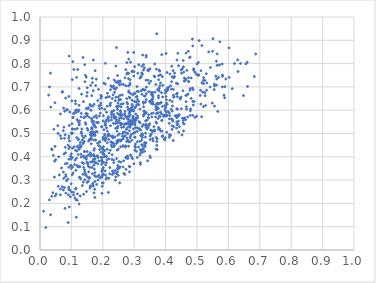
| Category | Series 0 |
|---|---|
| 0.24133575907295046 | 0.313 |
| 0.29681137395199564 | 0.501 |
| 0.5146433089513417 | 0.572 |
| 0.33936388168082465 | 0.531 |
| 0.09540957290847307 | 0.256 |
| 0.23797528929005785 | 0.569 |
| 0.3321072271578319 | 0.661 |
| 0.36888526393829935 | 0.711 |
| 0.2787899916616159 | 0.76 |
| 0.18313914826906252 | 0.459 |
| 0.268530565590514 | 0.539 |
| 0.20181165094042208 | 0.327 |
| 0.43556941891295553 | 0.568 |
| 0.1690899420757047 | 0.492 |
| 0.24917369250403676 | 0.469 |
| 0.23015126287975718 | 0.65 |
| 0.4723152782018156 | 0.853 |
| 0.2927946265178588 | 0.625 |
| 0.5509054937791694 | 0.907 |
| 0.2753449003418822 | 0.395 |
| 0.4010370395006366 | 0.659 |
| 0.1411642341868964 | 0.423 |
| 0.1244717191652619 | 0.432 |
| 0.3029622517354402 | 0.484 |
| 0.28274503329082434 | 0.465 |
| 0.2926548982961069 | 0.765 |
| 0.21447298175034424 | 0.46 |
| 0.2861844031500903 | 0.552 |
| 0.4246235664724103 | 0.665 |
| 0.2915581343551199 | 0.401 |
| 0.45584625142415736 | 0.556 |
| 0.07441713568750807 | 0.334 |
| 0.4533602886992796 | 0.778 |
| 0.0946139466498861 | 0.592 |
| 0.2910115269911113 | 0.611 |
| 0.249497383176289 | 0.433 |
| 0.1920238412898453 | 0.311 |
| 0.33740020814946226 | 0.729 |
| 0.24651519887395157 | 0.604 |
| 0.13885591177763246 | 0.46 |
| 0.3582619942358418 | 0.511 |
| 0.3876867383449908 | 0.838 |
| 0.12282849465019685 | 0.476 |
| 0.1628734862017046 | 0.456 |
| 0.16215045337986211 | 0.601 |
| 0.5181455106504436 | 0.678 |
| 0.12569568214964033 | 0.542 |
| 0.4260364483767939 | 0.656 |
| 0.13420420271338418 | 0.471 |
| 0.22816144791154402 | 0.57 |
| 0.20780787342312312 | 0.535 |
| 0.37935187190993747 | 0.63 |
| 0.25973042532163815 | 0.565 |
| 0.3331440773374382 | 0.424 |
| 0.32674074158228683 | 0.42 |
| 0.21166737881661746 | 0.591 |
| 0.4386840065862644 | 0.713 |
| 0.3882066857849432 | 0.557 |
| 0.3228811016556782 | 0.492 |
| 0.3870835647922718 | 0.675 |
| 0.5068542531036805 | 0.899 |
| 0.542892355299452 | 0.783 |
| 0.15788330099204706 | 0.475 |
| 0.3065887043817177 | 0.635 |
| 0.4057875758388464 | 0.578 |
| 0.08989670104872782 | 0.118 |
| 0.22911181883890752 | 0.595 |
| 0.29948622940016434 | 0.765 |
| 0.1176831775220969 | 0.425 |
| 0.2068309449878809 | 0.493 |
| 0.28269583656224995 | 0.819 |
| 0.21916138306718447 | 0.308 |
| 0.365660825927133 | 0.743 |
| 0.6023685515422398 | 0.741 |
| 0.04117833935427795 | 0.246 |
| 0.30612585995094777 | 0.565 |
| 0.112751092813974 | 0.262 |
| 0.1957423645925246 | 0.383 |
| 0.41925447723855913 | 0.563 |
| 0.44369793700075477 | 0.581 |
| 0.28168383093590577 | 0.704 |
| 0.5203566728674276 | 0.616 |
| 0.13235086725132317 | 0.669 |
| 0.24741770020419107 | 0.462 |
| 0.1973145131245848 | 0.436 |
| 0.3256690325660151 | 0.482 |
| 0.3027140772181598 | 0.549 |
| 0.43011192995775516 | 0.576 |
| 0.45895605479240864 | 0.541 |
| 0.6020968919683874 | 0.867 |
| 0.1692523238101432 | 0.54 |
| 0.11580354141087434 | 0.141 |
| 0.4001196210640897 | 0.619 |
| 0.5110428150240077 | 0.686 |
| 0.19353108283029474 | 0.631 |
| 0.3291058255173357 | 0.635 |
| 0.3904006006228543 | 0.657 |
| 0.5810589908788348 | 0.751 |
| 0.21766129060014916 | 0.737 |
| 0.25993448833770816 | 0.526 |
| 0.2118053050753923 | 0.524 |
| 0.512266793307081 | 0.626 |
| 0.531705717191981 | 0.717 |
| 0.3251519015588271 | 0.531 |
| 0.37320634284750187 | 0.63 |
| 0.09054966408185428 | 0.237 |
| 0.2539711560339398 | 0.722 |
| 0.521026950382869 | 0.714 |
| 0.19873291583593333 | 0.347 |
| 0.09219567655353933 | 0.49 |
| 0.22931234639496922 | 0.699 |
| 0.3679339653720177 | 0.571 |
| 0.49070081673634935 | 0.637 |
| 0.1362721466525838 | 0.456 |
| 0.0465251979304504 | 0.381 |
| 0.24839616090330363 | 0.718 |
| 0.1668730485855695 | 0.719 |
| 0.4349956450554253 | 0.578 |
| 0.659911801624693 | 0.806 |
| 0.05950519777728336 | 0.4 |
| 0.5497062812814689 | 0.853 |
| 0.24918094560629445 | 0.32 |
| 0.14720937021839886 | 0.742 |
| 0.28157840895192887 | 0.549 |
| 0.2784182129219054 | 0.403 |
| 0.1390374756618742 | 0.239 |
| 0.2452632171051008 | 0.51 |
| 0.1608895445742573 | 0.378 |
| 0.27285671587721816 | 0.543 |
| 0.3925642500000577 | 0.58 |
| 0.44678230374324135 | 0.648 |
| 0.23426064308889216 | 0.457 |
| 0.4090584531451732 | 0.698 |
| 0.27475072175352044 | 0.517 |
| 0.15790496139447374 | 0.311 |
| 0.1526762895204684 | 0.367 |
| 0.2758315712725483 | 0.466 |
| 0.09978332227212727 | 0.413 |
| 0.49883544953974146 | 0.574 |
| 0.10774995222877715 | 0.775 |
| 0.19361372339408522 | 0.651 |
| 0.1447850470548594 | 0.321 |
| 0.16210265490021425 | 0.273 |
| 0.5810914760257391 | 0.745 |
| 0.16694346936005644 | 0.327 |
| 0.4115577197510635 | 0.484 |
| 0.19465724928891293 | 0.42 |
| 0.4121056044253463 | 0.495 |
| 0.4783573604870066 | 0.693 |
| 0.43413805576281606 | 0.716 |
| 0.38216899217146627 | 0.573 |
| 0.07513827844790277 | 0.609 |
| 0.2011902520895522 | 0.554 |
| 0.38460171381969077 | 0.511 |
| 0.3974305977788746 | 0.473 |
| 0.08206195211641787 | 0.323 |
| 0.3460166143231639 | 0.566 |
| 0.1462697698262032 | 0.586 |
| 0.15377703931166253 | 0.295 |
| 0.3988662899997677 | 0.686 |
| 0.3182319897314859 | 0.546 |
| 0.3017692459617335 | 0.429 |
| 0.0648433581397907 | 0.237 |
| 0.29834423344723904 | 0.597 |
| 0.3042683395925345 | 0.44 |
| 0.1662820289025152 | 0.378 |
| 0.39762287960928444 | 0.62 |
| 0.17569242946090247 | 0.491 |
| 0.17468115218120794 | 0.226 |
| 0.1028869443638073 | 0.731 |
| 0.5273426104671624 | 0.62 |
| 0.23659014024386593 | 0.33 |
| 0.06489361695517248 | 0.49 |
| 0.10447303788854401 | 0.809 |
| 0.03424625253398872 | 0.613 |
| 0.17240130594443248 | 0.626 |
| 0.23982701362424486 | 0.691 |
| 0.12797139027459625 | 0.231 |
| 0.25854206090863774 | 0.614 |
| 0.4881561814276688 | 0.622 |
| 0.16877403631015198 | 0.507 |
| 0.254583930100198 | 0.581 |
| 0.30993077126493995 | 0.397 |
| 0.3028612551677117 | 0.536 |
| 0.3648833140290971 | 0.51 |
| 0.1840135642798476 | 0.37 |
| 0.150304831283957 | 0.423 |
| 0.34467929536072595 | 0.568 |
| 0.20049204834779322 | 0.475 |
| 0.2731283333710177 | 0.397 |
| 0.274190936200407 | 0.542 |
| 0.6295946024735721 | 0.816 |
| 0.320156811899204 | 0.416 |
| 0.4155269179832225 | 0.492 |
| 0.33295960744913145 | 0.455 |
| 0.25309441029699975 | 0.566 |
| 0.3814872215457076 | 0.704 |
| 0.170870028845576 | 0.552 |
| 0.35969167415943026 | 0.631 |
| 0.4056859168401127 | 0.684 |
| 0.1424080934955091 | 0.336 |
| 0.2803236171336334 | 0.393 |
| 0.09887267675983324 | 0.362 |
| 0.302126055484495 | 0.445 |
| 0.21387961567083802 | 0.617 |
| 0.19650709618252016 | 0.38 |
| 0.13842102488831276 | 0.637 |
| 0.3248031983933437 | 0.668 |
| 0.27134781654189566 | 0.576 |
| 0.25274919620305947 | 0.647 |
| 0.4667170105585483 | 0.605 |
| 0.32228747412663283 | 0.427 |
| 0.09184529098405647 | 0.39 |
| 0.12449769718054415 | 0.621 |
| 0.12209760282670334 | 0.594 |
| 0.24799695926643306 | 0.492 |
| 0.3253813423352151 | 0.5 |
| 0.32060439429810395 | 0.515 |
| 0.4648654600011427 | 0.734 |
| 0.1626506855744162 | 0.49 |
| 0.08461550903334292 | 0.297 |
| 0.32639114210237175 | 0.432 |
| 0.2529910653912917 | 0.709 |
| 0.35168029756777663 | 0.397 |
| 0.26639666191720024 | 0.383 |
| 0.4015288783389602 | 0.575 |
| 0.22146523910443527 | 0.491 |
| 0.2778834346729523 | 0.393 |
| 0.13675738856809438 | 0.826 |
| 0.3626762942155214 | 0.529 |
| 0.2488546533463245 | 0.615 |
| 0.22387446319213178 | 0.62 |
| 0.2412883642330742 | 0.656 |
| 0.027710772383338966 | 0.665 |
| 0.22465201301646565 | 0.631 |
| 0.16996569446001142 | 0.816 |
| 0.2851481897000884 | 0.512 |
| 0.4222143035605125 | 0.559 |
| 0.29107129224713624 | 0.552 |
| 0.3010192785807908 | 0.638 |
| 0.45776763262212916 | 0.763 |
| 0.12583949410040796 | 0.312 |
| 0.2347903082970778 | 0.375 |
| 0.20696262693674783 | 0.474 |
| 0.08249994140121542 | 0.244 |
| 0.2519740133722028 | 0.351 |
| 0.39381078449885454 | 0.573 |
| 0.28715172700622527 | 0.482 |
| 0.04256958684497125 | 0.406 |
| 0.30386313733975356 | 0.454 |
| 0.2946523979442087 | 0.392 |
| 0.22956291127106443 | 0.409 |
| 0.12186766131129756 | 0.551 |
| 0.3593627412296888 | 0.648 |
| 0.17261890633434984 | 0.571 |
| 0.3180607475507451 | 0.407 |
| 0.11499323295951769 | 0.265 |
| 0.3655367574770717 | 0.515 |
| 0.05015658286207714 | 0.388 |
| 0.3689317669339327 | 0.549 |
| 0.2908506296738943 | 0.496 |
| 0.3890865201680094 | 0.51 |
| 0.2176715060473211 | 0.247 |
| 0.2357878052253085 | 0.694 |
| 0.2059001558156217 | 0.497 |
| 0.4661618603892205 | 0.615 |
| 0.12803944993405447 | 0.462 |
| 0.03375594043959751 | 0.151 |
| 0.5643019821558095 | 0.792 |
| 0.17504566163213253 | 0.332 |
| 0.43534312980655565 | 0.549 |
| 0.18948621524098752 | 0.465 |
| 0.38935361344670283 | 0.487 |
| 0.2412528857962054 | 0.722 |
| 0.38378700820116063 | 0.716 |
| 0.418715939042112 | 0.69 |
| 0.1792869096963282 | 0.733 |
| 0.09334011288469235 | 0.535 |
| 0.2521994146739075 | 0.581 |
| 0.0966399516311699 | 0.229 |
| 0.2276800589105381 | 0.558 |
| 0.31830148264678226 | 0.605 |
| 0.18634076024079838 | 0.69 |
| 0.24243771774714162 | 0.72 |
| 0.47063245327211234 | 0.571 |
| 0.2092440056429048 | 0.483 |
| 0.11667806512339318 | 0.741 |
| 0.30170915810353405 | 0.484 |
| 0.24402072079138626 | 0.328 |
| 0.21767473974212503 | 0.562 |
| 0.19867790863672974 | 0.435 |
| 0.26477740236977143 | 0.628 |
| 0.4028879126900119 | 0.68 |
| 0.1547722702967167 | 0.408 |
| 0.22062467780550543 | 0.658 |
| 0.26473908932255896 | 0.356 |
| 0.42108424381861287 | 0.596 |
| 0.272863903754451 | 0.447 |
| 0.19223815765835217 | 0.31 |
| 0.378058582258493 | 0.748 |
| 0.3049561645567579 | 0.584 |
| 0.2709590358446893 | 0.595 |
| 0.21465069132130932 | 0.51 |
| 0.17137914965675327 | 0.387 |
| 0.10370186189954378 | 0.437 |
| 0.33807332320419303 | 0.646 |
| 0.20992099781555829 | 0.654 |
| 0.17389603247303653 | 0.532 |
| 0.4205585570485908 | 0.518 |
| 0.20121468221002747 | 0.416 |
| 0.1648944525074465 | 0.474 |
| 0.16436372934357013 | 0.518 |
| 0.24709504300291252 | 0.336 |
| 0.2817379661930314 | 0.736 |
| 0.22579851386767313 | 0.705 |
| 0.46755412711329314 | 0.771 |
| 0.4729937863344307 | 0.74 |
| 0.15429775763341047 | 0.359 |
| 0.1092269908049579 | 0.587 |
| 0.6870976350986653 | 0.841 |
| 0.1737539765303474 | 0.498 |
| 0.2934097953789616 | 0.642 |
| 0.0707867779710748 | 0.272 |
| 0.4289546895907138 | 0.759 |
| 0.3861494224682347 | 0.634 |
| 0.2442271496154521 | 0.615 |
| 0.4557801253054975 | 0.545 |
| 0.17308172108756725 | 0.347 |
| 0.2879651060703933 | 0.488 |
| 0.6826784905218303 | 0.744 |
| 0.2438715491585105 | 0.559 |
| 0.28221484973145095 | 0.561 |
| 0.33812073001961174 | 0.835 |
| 0.08639313976492013 | 0.372 |
| 0.5886480885566107 | 0.701 |
| 0.11857784529762505 | 0.214 |
| 0.24670441722622005 | 0.587 |
| 0.34279849102789606 | 0.383 |
| 0.2865447840590144 | 0.652 |
| 0.30316159986157787 | 0.506 |
| 0.2571773892368008 | 0.587 |
| 0.2778909089322009 | 0.501 |
| 0.3501787508106323 | 0.778 |
| 0.31388113034380993 | 0.442 |
| 0.2849313914326346 | 0.598 |
| 0.20320594657750324 | 0.376 |
| 0.16470308036013637 | 0.662 |
| 0.17518744677689602 | 0.294 |
| 0.29842245593600025 | 0.848 |
| 0.16806997185033834 | 0.286 |
| 0.44992222415008587 | 0.606 |
| 0.36013059022653293 | 0.587 |
| 0.3334183748262993 | 0.46 |
| 0.3675726537902285 | 0.623 |
| 0.1761259646298845 | 0.373 |
| 0.29824884585041 | 0.557 |
| 0.4015991266914144 | 0.844 |
| 0.1671911429097237 | 0.378 |
| 0.3349157033001713 | 0.687 |
| 0.1316172808151701 | 0.586 |
| 0.2529496016611579 | 0.498 |
| 0.45998519908576396 | 0.725 |
| 0.11935191138327783 | 0.241 |
| 0.38583544649093937 | 0.586 |
| 0.2274563206992012 | 0.45 |
| 0.3743857585781706 | 0.688 |
| 0.3719394540586016 | 0.465 |
| 0.07426948129181998 | 0.512 |
| 0.31631607876239043 | 0.52 |
| 0.24201104677513274 | 0.57 |
| 0.3350901911821239 | 0.661 |
| 0.15130572455969538 | 0.314 |
| 0.2794550315884712 | 0.541 |
| 0.29901640508829774 | 0.747 |
| 0.15083712871602506 | 0.584 |
| 0.20931803126488446 | 0.479 |
| 0.17722095145608507 | 0.706 |
| 0.235978427127155 | 0.73 |
| 0.3267266174006954 | 0.448 |
| 0.17767761020583983 | 0.526 |
| 0.22192984018603268 | 0.327 |
| 0.32754992829716645 | 0.492 |
| 0.23962368299524317 | 0.341 |
| 0.05785164643012364 | 0.274 |
| 0.07870039064401102 | 0.595 |
| 0.36559783112787647 | 0.798 |
| 0.37297215110985904 | 0.604 |
| 0.20487484665845668 | 0.4 |
| 0.3476608427835195 | 0.535 |
| 0.4389587359512397 | 0.844 |
| 0.1972343579138175 | 0.385 |
| 0.26584323638090446 | 0.71 |
| 0.37744913421915083 | 0.662 |
| 0.16171016297215346 | 0.402 |
| 0.3444006570746301 | 0.773 |
| 0.2761395119838689 | 0.649 |
| 0.3108758687938874 | 0.566 |
| 0.29552214155971 | 0.541 |
| 0.23478465562420492 | 0.598 |
| 0.48658948308310357 | 0.876 |
| 0.4892745744304231 | 0.772 |
| 0.5714011664913365 | 0.794 |
| 0.14460878987518233 | 0.489 |
| 0.10259810238975375 | 0.396 |
| 0.287252283929058 | 0.579 |
| 0.3313959880876839 | 0.582 |
| 0.21022929762413034 | 0.304 |
| 0.07230523763649721 | 0.679 |
| 0.17846944389093944 | 0.508 |
| 0.12706073455011546 | 0.358 |
| 0.19912230004642983 | 0.343 |
| 0.2938404874565981 | 0.603 |
| 0.1702858769216954 | 0.405 |
| 0.21475332258501856 | 0.672 |
| 0.3109005387405025 | 0.646 |
| 0.5211724820468411 | 0.74 |
| 0.27625672442731075 | 0.755 |
| 0.11995497505376251 | 0.775 |
| 0.4116278458338557 | 0.544 |
| 0.19457411959728566 | 0.398 |
| 0.3045125964944072 | 0.524 |
| 0.1912278110058615 | 0.445 |
| 0.4349250652967356 | 0.523 |
| 0.33289585709595226 | 0.686 |
| 0.22781974604937816 | 0.581 |
| 0.3348392658166158 | 0.46 |
| 0.1590182264865443 | 0.355 |
| 0.3549035329367106 | 0.667 |
| 0.39522895584581774 | 0.477 |
| 0.3167465662718715 | 0.519 |
| 0.102599544767772 | 0.519 |
| 0.4814108165099322 | 0.651 |
| 0.11508289987190501 | 0.59 |
| 0.3987663801333883 | 0.673 |
| 0.15887996515673664 | 0.266 |
| 0.47964190994400013 | 0.606 |
| 0.2901071138698441 | 0.556 |
| 0.250759795603154 | 0.642 |
| 0.10153531827261297 | 0.64 |
| 0.07652714664439364 | 0.412 |
| 0.2513708986396386 | 0.38 |
| 0.29667663020889246 | 0.574 |
| 0.35856417744643077 | 0.626 |
| 0.17414050666989145 | 0.402 |
| 0.3840149892372854 | 0.752 |
| 0.337285938696295 | 0.527 |
| 0.2580164905270662 | 0.626 |
| 0.37204852181072223 | 0.449 |
| 0.5660979516986996 | 0.594 |
| 0.20901584587134314 | 0.365 |
| 0.476501092773837 | 0.826 |
| 0.26685169593236413 | 0.528 |
| 0.1851549502176585 | 0.397 |
| 0.2697937080624101 | 0.584 |
| 0.19210421502040687 | 0.587 |
| 0.14892047293818578 | 0.661 |
| 0.12357057483716505 | 0.601 |
| 0.2924222149270461 | 0.547 |
| 0.35103905982739236 | 0.474 |
| 0.25748319006093645 | 0.542 |
| 0.11124149864658239 | 0.518 |
| 0.17978195017061072 | 0.547 |
| 0.29562678752023897 | 0.554 |
| 0.5640479267882067 | 0.842 |
| 0.12320558620150601 | 0.438 |
| 0.4005989718951296 | 0.58 |
| 0.5000746658809525 | 0.798 |
| 0.4391203928818692 | 0.54 |
| 0.2440084343329022 | 0.392 |
| 0.13859193830808725 | 0.481 |
| 0.20163107397644053 | 0.354 |
| 0.19870341827874183 | 0.32 |
| 0.16831634900530745 | 0.493 |
| 0.37054697135458814 | 0.776 |
| 0.16549681020889317 | 0.354 |
| 0.4592163375563201 | 0.564 |
| 0.32087774064947494 | 0.491 |
| 0.4366495879559672 | 0.538 |
| 0.353980566222876 | 0.677 |
| 0.5156261606636522 | 0.877 |
| 0.31440806753143413 | 0.68 |
| 0.4209568887210182 | 0.637 |
| 0.045997481641889326 | 0.313 |
| 0.282663028775216 | 0.758 |
| 0.105407023548033 | 0.331 |
| 0.17307331260488823 | 0.435 |
| 0.33704766506217654 | 0.54 |
| 0.31825383095343485 | 0.738 |
| 0.1127457479981483 | 0.64 |
| 0.5630212070971523 | 0.734 |
| 0.15473269508759224 | 0.467 |
| 0.46907982026614214 | 0.666 |
| 0.17564555082943245 | 0.769 |
| 0.5417857071519114 | 0.699 |
| 0.4418148311620368 | 0.506 |
| 0.029914633301752924 | 0.215 |
| 0.3583879349998973 | 0.509 |
| 0.27906606928360567 | 0.613 |
| 0.4207464416086635 | 0.743 |
| 0.3877230934366146 | 0.556 |
| 0.3984182272448451 | 0.599 |
| 0.16217515593293774 | 0.505 |
| 0.42489322412968655 | 0.689 |
| 0.18526058385284305 | 0.548 |
| 0.2647562753880607 | 0.448 |
| 0.18401790714512234 | 0.642 |
| 0.2367965227582023 | 0.566 |
| 0.4569722528094593 | 0.786 |
| 0.1006948335990322 | 0.249 |
| 0.10628884521712312 | 0.586 |
| 0.31469727252142243 | 0.795 |
| 0.3229258855523116 | 0.684 |
| 0.03027923763677276 | 0.7 |
| 0.5100031244837233 | 0.663 |
| 0.09153159689878732 | 0.356 |
| 0.3270097125380155 | 0.837 |
| 0.1418947662594443 | 0.422 |
| 0.15665729754028834 | 0.57 |
| 0.27182083638782784 | 0.442 |
| 0.22845430358096586 | 0.486 |
| 0.37945620749644215 | 0.773 |
| 0.1973059457355688 | 0.243 |
| 0.25642394695567117 | 0.645 |
| 0.13215692250413968 | 0.501 |
| 0.2880222611006248 | 0.672 |
| 0.1686142432574973 | 0.38 |
| 0.4241394302580819 | 0.47 |
| 0.2973243868082951 | 0.52 |
| 0.1849837770335675 | 0.3 |
| 0.4854060080161182 | 0.906 |
| 0.14291372981432016 | 0.722 |
| 0.2081067220416244 | 0.713 |
| 0.04841051025151977 | 0.232 |
| 0.1342380448281103 | 0.491 |
| 0.06785855632531046 | 0.478 |
| 0.37907258384414544 | 0.692 |
| 0.34619975569282446 | 0.68 |
| 0.27077766204246856 | 0.739 |
| 0.3703139030733791 | 0.614 |
| 0.05162841572328469 | 0.24 |
| 0.11796126758295411 | 0.363 |
| 0.20165609326836886 | 0.577 |
| 0.10396357525274325 | 0.501 |
| 0.21154783012388867 | 0.375 |
| 0.3383301621145848 | 0.59 |
| 0.30528880725149743 | 0.566 |
| 0.19582570337089655 | 0.659 |
| 0.17746536110046174 | 0.315 |
| 0.10198991718651251 | 0.542 |
| 0.35300250507429354 | 0.724 |
| 0.24851402940811773 | 0.63 |
| 0.4523901398673359 | 0.494 |
| 0.19691311330252936 | 0.609 |
| 0.0929846007102334 | 0.832 |
| 0.2951308231122305 | 0.567 |
| 0.11010324615322198 | 0.367 |
| 0.11120202587148131 | 0.223 |
| 0.19642912286561987 | 0.368 |
| 0.2576480200785496 | 0.377 |
| 0.09920129922076482 | 0.284 |
| 0.17542140278011187 | 0.391 |
| 0.43564999049778264 | 0.57 |
| 0.3731131287890499 | 0.431 |
| 0.5194993941692442 | 0.727 |
| 0.3493767804777719 | 0.542 |
| 0.3561992331803373 | 0.571 |
| 0.21855896086867532 | 0.475 |
| 0.5251352909485711 | 0.675 |
| 0.30233144281203683 | 0.671 |
| 0.4196783987802929 | 0.789 |
| 0.11723285314131504 | 0.602 |
| 0.3014374440294718 | 0.787 |
| 0.3236806511751209 | 0.76 |
| 0.4133839712204098 | 0.642 |
| 0.6384403120308463 | 0.801 |
| 0.4192004958409876 | 0.722 |
| 0.24845461821916126 | 0.349 |
| 0.07434167559522531 | 0.258 |
| 0.5860095590978215 | 0.664 |
| 0.3342941990043409 | 0.449 |
| 0.18286018437233675 | 0.404 |
| 0.21161404415626017 | 0.401 |
| 0.13330239290356283 | 0.52 |
| 0.2197857574607477 | 0.416 |
| 0.1148594817036298 | 0.215 |
| 0.5559000221073609 | 0.704 |
| 0.32354116234086483 | 0.452 |
| 0.20620996302452865 | 0.604 |
| 0.17142570246924882 | 0.364 |
| 0.16133300384191285 | 0.618 |
| 0.3813872014339299 | 0.768 |
| 0.30119920722830573 | 0.504 |
| 0.08047511773577187 | 0.37 |
| 0.15013409298488367 | 0.29 |
| 0.15937676009599921 | 0.625 |
| 0.12458767174808194 | 0.198 |
| 0.4250132388946518 | 0.739 |
| 0.21681417157138938 | 0.493 |
| 0.057434365098829265 | 0.5 |
| 0.155102232786009 | 0.336 |
| 0.19760057275597664 | 0.397 |
| 0.4635816302642167 | 0.559 |
| 0.47132823569263893 | 0.67 |
| 0.09884826438063887 | 0.39 |
| 0.17756205892046406 | 0.472 |
| 0.4976876246719556 | 0.755 |
| 0.2715894723173381 | 0.491 |
| 0.26497828282228764 | 0.506 |
| 0.12579124442187573 | 0.358 |
| 0.11699463080777828 | 0.483 |
| 0.4377260980405123 | 0.604 |
| 0.23259341452290683 | 0.481 |
| 0.2857555456556816 | 0.465 |
| 0.09185700321894785 | 0.659 |
| 0.19412654318513156 | 0.663 |
| 0.6307642468178658 | 0.766 |
| 0.323992201769988 | 0.471 |
| 0.23898802879369585 | 0.485 |
| 0.3974545186954467 | 0.578 |
| 0.2159013231243878 | 0.566 |
| 0.3500118456991742 | 0.404 |
| 0.3837815771604114 | 0.592 |
| 0.16526267397303984 | 0.553 |
| 0.39093754828749505 | 0.707 |
| 0.4614577556113624 | 0.567 |
| 0.1826935743058703 | 0.403 |
| 0.2733001019297887 | 0.774 |
| 0.19779431765103095 | 0.313 |
| 0.3296749538626821 | 0.629 |
| 0.3316070153297127 | 0.596 |
| 0.11856339752577683 | 0.445 |
| 0.32384775410545885 | 0.684 |
| 0.2579861525269048 | 0.575 |
| 0.4021216402350246 | 0.631 |
| 0.2849673150979737 | 0.336 |
| 0.43720858377060257 | 0.673 |
| 0.36330542049804637 | 0.512 |
| 0.45629509056917616 | 0.814 |
| 0.2818808049057615 | 0.445 |
| 0.26353709531252956 | 0.445 |
| 0.2499499327301138 | 0.725 |
| 0.10249077323258737 | 0.323 |
| 0.35069425542614807 | 0.488 |
| 0.20626340954038558 | 0.427 |
| 0.22650154903980524 | 0.462 |
| 0.06154295832234835 | 0.322 |
| 0.15030455545717614 | 0.696 |
| 0.14471009011828762 | 0.749 |
| 0.19830090950674717 | 0.288 |
| 0.580831882046609 | 0.7 |
| 0.3727628159429498 | 0.614 |
| 0.18998751067265607 | 0.431 |
| 0.37723213123337296 | 0.653 |
| 0.2951985002605987 | 0.617 |
| 0.5486183179835828 | 0.631 |
| 0.2874413658456344 | 0.593 |
| 0.5021935477407736 | 0.751 |
| 0.30906176896038307 | 0.701 |
| 0.2731402083229192 | 0.54 |
| 0.16530534874537595 | 0.563 |
| 0.38015406354327785 | 0.575 |
| 0.08064848342568087 | 0.441 |
| 0.37186373644798787 | 0.928 |
| 0.201459016730959 | 0.43 |
| 0.17348235300283799 | 0.501 |
| 0.2318662858929298 | 0.46 |
| 0.5550183779511986 | 0.712 |
| 0.13651908827476322 | 0.325 |
| 0.23448742613112883 | 0.704 |
| 0.3361397122648273 | 0.502 |
| 0.26719925236166175 | 0.564 |
| 0.2096500464790162 | 0.552 |
| 0.10897727160186443 | 0.443 |
| 0.08718305429841533 | 0.602 |
| 0.2791643402524321 | 0.472 |
| 0.23819521129329324 | 0.571 |
| 0.1294770276472027 | 0.441 |
| 0.13843586566816568 | 0.403 |
| 0.1445448732384832 | 0.546 |
| 0.16450620830919693 | 0.563 |
| 0.14945228293116386 | 0.377 |
| 0.4358430709086719 | 0.606 |
| 0.13139254430800018 | 0.399 |
| 0.37161176044729693 | 0.545 |
| 0.2990803228121922 | 0.37 |
| 0.18728370614730527 | 0.618 |
| 0.4132819718686386 | 0.577 |
| 0.1308850925028211 | 0.571 |
| 0.48155831611318656 | 0.738 |
| 0.3156475353603425 | 0.551 |
| 0.21147649169216787 | 0.402 |
| 0.30930671976503854 | 0.659 |
| 0.19648270439998017 | 0.337 |
| 0.14744502973496354 | 0.39 |
| 0.06514501523502358 | 0.262 |
| 0.09202720565681133 | 0.435 |
| 0.247821200476675 | 0.363 |
| 0.3911677881962974 | 0.49 |
| 0.21935032527988285 | 0.391 |
| 0.2836061157493144 | 0.586 |
| 0.03733180978235606 | 0.434 |
| 0.28690613372718254 | 0.526 |
| 0.30495215017037824 | 0.615 |
| 0.2701896148686256 | 0.324 |
| 0.2835719477478965 | 0.573 |
| 0.4504658088204283 | 0.759 |
| 0.3401526502960225 | 0.519 |
| 0.38134258652356356 | 0.519 |
| 0.08203465379179997 | 0.315 |
| 0.3544289808122846 | 0.629 |
| 0.22906161413257642 | 0.443 |
| 0.3567980722110803 | 0.64 |
| 0.03748525930961111 | 0.23 |
| 0.4934119176696812 | 0.569 |
| 0.44949054696798707 | 0.657 |
| 0.20025882614312007 | 0.376 |
| 0.4276611396405736 | 0.742 |
| 0.011452713495715194 | 0.166 |
| 0.37797131531223904 | 0.525 |
| 0.37034921701199175 | 0.483 |
| 0.21858744208654401 | 0.498 |
| 0.08472862782192436 | 0.602 |
| 0.31471848726762064 | 0.624 |
| 0.4855452036293221 | 0.695 |
| 0.2857939977933204 | 0.541 |
| 0.22445609066990801 | 0.688 |
| 0.2645766905205965 | 0.476 |
| 0.1566567409871561 | 0.308 |
| 0.20836842757272545 | 0.537 |
| 0.25683159291165825 | 0.467 |
| 0.16951492917555844 | 0.684 |
| 0.2797179802667672 | 0.848 |
| 0.30539004610942777 | 0.557 |
| 0.3455939024240382 | 0.769 |
| 0.07773254655003037 | 0.268 |
| 0.2875534320202452 | 0.606 |
| 0.2839436823088195 | 0.656 |
| 0.2786968239155022 | 0.525 |
| 0.3266013041493714 | 0.431 |
| 0.27407066640975186 | 0.346 |
| 0.4347061748210974 | 0.669 |
| 0.292535323582812 | 0.54 |
| 0.3097739754313342 | 0.464 |
| 0.17208518894406732 | 0.245 |
| 0.28090955271529017 | 0.602 |
| 0.6560028456200244 | 0.799 |
| 0.05661774268373054 | 0.533 |
| 0.5802860664700413 | 0.798 |
| 0.09168033099606032 | 0.27 |
| 0.223938820310021 | 0.428 |
| 0.11161212717099223 | 0.386 |
| 0.20181872549510527 | 0.412 |
| 0.4895025876731962 | 0.778 |
| 0.3310461627296334 | 0.595 |
| 0.11822041323279386 | 0.559 |
| 0.4279393974252024 | 0.745 |
| 0.47380530019660216 | 0.723 |
| 0.4406403453519617 | 0.576 |
| 0.11341414004844119 | 0.627 |
| 0.12092759137530396 | 0.357 |
| 0.16240975337622088 | 0.6 |
| 0.11313577413021247 | 0.428 |
| 0.3061455478320968 | 0.657 |
| 0.37932857107062135 | 0.694 |
| 0.28279130210312353 | 0.683 |
| 0.23979901200527876 | 0.299 |
| 0.5917690056617558 | 0.734 |
| 0.19288627747318077 | 0.622 |
| 0.1768246502254267 | 0.377 |
| 0.1377421029802648 | 0.291 |
| 0.3697413162570068 | 0.611 |
| 0.45942254593854803 | 0.725 |
| 0.2406677515347212 | 0.542 |
| 0.2866382581789072 | 0.716 |
| 0.248578257529681 | 0.357 |
| 0.3601520511534606 | 0.468 |
| 0.2047269714060389 | 0.476 |
| 0.20476729015035144 | 0.409 |
| 0.1837938215282906 | 0.315 |
| 0.2014967889286503 | 0.484 |
| 0.23733289249690226 | 0.677 |
| 0.2585956262011109 | 0.544 |
| 0.1681121679491202 | 0.618 |
| 0.14279302129781712 | 0.572 |
| 0.2570815563704226 | 0.537 |
| 0.5154822535348018 | 0.717 |
| 0.21878664932913072 | 0.554 |
| 0.12653812033816703 | 0.45 |
| 0.24332403733166008 | 0.457 |
| 0.3473949352577982 | 0.715 |
| 0.465186953110885 | 0.637 |
| 0.3107756576786137 | 0.575 |
| 0.3535398827382086 | 0.496 |
| 0.25130637201978745 | 0.618 |
| 0.37320534087921486 | 0.477 |
| 0.42204128311850353 | 0.618 |
| 0.32401267364519426 | 0.489 |
| 0.28846055712073515 | 0.806 |
| 0.23643993318951595 | 0.575 |
| 0.5055306132595779 | 0.75 |
| 0.08158709401555397 | 0.651 |
| 0.2762763668872893 | 0.569 |
| 0.134196340851941 | 0.375 |
| 0.1052790725632029 | 0.57 |
| 0.2518333491343272 | 0.473 |
| 0.3279014335281347 | 0.69 |
| 0.28795352762348714 | 0.408 |
| 0.18239362120357328 | 0.507 |
| 0.4149853830865575 | 0.493 |
| 0.5254289101992933 | 0.728 |
| 0.1144137465839602 | 0.342 |
| 0.4122711117631511 | 0.563 |
| 0.3099420472565043 | 0.51 |
| 0.3196721390625251 | 0.43 |
| 0.44384570845026927 | 0.529 |
| 0.27932455156047675 | 0.499 |
| 0.2866446176779469 | 0.71 |
| 0.2143221392667819 | 0.432 |
| 0.2860854483734243 | 0.357 |
| 0.5728605127242784 | 0.893 |
| 0.25962882171968105 | 0.474 |
| 0.23278953022824855 | 0.666 |
| 0.13177533055157697 | 0.507 |
| 0.3434106508392337 | 0.772 |
| 0.09769949857638249 | 0.402 |
| 0.33059919855507947 | 0.582 |
| 0.08122238721081709 | 0.417 |
| 0.3462003086141985 | 0.581 |
| 0.6193459557939125 | 0.8 |
| 0.2764788937566919 | 0.804 |
| 0.3797093431436883 | 0.682 |
| 0.018331489910696885 | 0.096 |
| 0.34452234806062954 | 0.729 |
| 0.5048827389437328 | 0.751 |
| 0.2988544629715225 | 0.562 |
| 0.3898047892716524 | 0.616 |
| 0.2939223390958674 | 0.598 |
| 0.29444211235255036 | 0.768 |
| 0.3773700032212318 | 0.608 |
| 0.32947692460373257 | 0.772 |
| 0.1393735427827555 | 0.371 |
| 0.22943160139721563 | 0.389 |
| 0.5043052258167147 | 0.805 |
| 0.26249396476933173 | 0.579 |
| 0.4878276805832873 | 0.689 |
| 0.4789745397193187 | 0.578 |
| 0.21660918528579753 | 0.658 |
| 0.33626862527837365 | 0.554 |
| 0.07625090838874682 | 0.527 |
| 0.20156518277261004 | 0.288 |
| 0.40772496076633447 | 0.594 |
| 0.126593297216964 | 0.312 |
| 0.3198506945193548 | 0.375 |
| 0.11877647582715856 | 0.522 |
| 0.09789131484974822 | 0.363 |
| 0.48640849330014513 | 0.578 |
| 0.25591049929724474 | 0.596 |
| 0.10374034327832315 | 0.52 |
| 0.16881422314479733 | 0.507 |
| 0.4002534265940304 | 0.614 |
| 0.3695688632269857 | 0.433 |
| 0.06499168897634022 | 0.584 |
| 0.14586281116956834 | 0.54 |
| 0.24081335513423607 | 0.523 |
| 0.5294614566653799 | 0.757 |
| 0.21823413486851295 | 0.572 |
| 0.28876252754292453 | 0.546 |
| 0.08948858500282131 | 0.45 |
| 0.328286837079676 | 0.538 |
| 0.4270835505592441 | 0.658 |
| 0.26213354395529376 | 0.666 |
| 0.3357076596032976 | 0.484 |
| 0.16339598119363252 | 0.48 |
| 0.18095275804813638 | 0.567 |
| 0.4258924274206203 | 0.529 |
| 0.12443832454370607 | 0.536 |
| 0.23026925820218103 | 0.324 |
| 0.20703358591583432 | 0.34 |
| 0.530687393820413 | 0.686 |
| 0.2732078984713596 | 0.705 |
| 0.28365966445875834 | 0.604 |
| 0.3635395588347047 | 0.747 |
| 0.4372372508259562 | 0.572 |
| 0.42380834704012893 | 0.77 |
| 0.3986903114959579 | 0.606 |
| 0.2082067121037684 | 0.801 |
| 0.10338954197251748 | 0.356 |
| 0.1786546364688223 | 0.577 |
| 0.18869745564364737 | 0.575 |
| 0.47263213551522565 | 0.723 |
| 0.12190333419479027 | 0.41 |
| 0.4035013113654845 | 0.505 |
| 0.37781048974635423 | 0.731 |
| 0.47880383448151387 | 0.598 |
| 0.16092559507844395 | 0.494 |
| 0.14139995420986362 | 0.396 |
| 0.04400561068024755 | 0.518 |
| 0.10527854146773608 | 0.568 |
| 0.17201028133953622 | 0.428 |
| 0.3246688688977568 | 0.788 |
| 0.3490709639193975 | 0.639 |
| 0.20777770186132638 | 0.469 |
| 0.3298515131644757 | 0.796 |
| 0.09327098694587543 | 0.185 |
| 0.3662291967238416 | 0.678 |
| 0.29491166141003977 | 0.666 |
| 0.2564104588887973 | 0.597 |
| 0.07786515600623156 | 0.479 |
| 0.3359216809091783 | 0.634 |
| 0.24703900182438676 | 0.749 |
| 0.41177832739678677 | 0.588 |
| 0.3773047127129243 | 0.518 |
| 0.415925529905263 | 0.705 |
| 0.33823217098970915 | 0.828 |
| 0.2416364648307353 | 0.789 |
| 0.14720923117792006 | 0.608 |
| 0.12975987904414055 | 0.305 |
| 0.4781036853568965 | 0.828 |
| 0.06862938461453183 | 0.352 |
| 0.2825046728986015 | 0.678 |
| 0.399312965552338 | 0.482 |
| 0.16114477083544498 | 0.706 |
| 0.245761488135404 | 0.429 |
| 0.2785443940943493 | 0.402 |
| 0.3452840317501752 | 0.536 |
| 0.3266641927671322 | 0.754 |
| 0.27085569610885374 | 0.506 |
| 0.10652755767969269 | 0.248 |
| 0.31719489705680426 | 0.466 |
| 0.2275577818034502 | 0.59 |
| 0.19631602089172207 | 0.529 |
| 0.24804518345466298 | 0.545 |
| 0.11275769002809255 | 0.598 |
| 0.3558818577223206 | 0.646 |
| 0.4177228745114411 | 0.604 |
| 0.2867423656743441 | 0.731 |
| 0.145552581964972 | 0.327 |
| 0.16812218444214655 | 0.282 |
| 0.17044822067998278 | 0.39 |
| 0.4571991971096431 | 0.511 |
| 0.2445599653609425 | 0.617 |
| 0.1400352812846022 | 0.567 |
| 0.46516549837175736 | 0.845 |
| 0.3197594465788547 | 0.368 |
| 0.12134434613311784 | 0.473 |
| 0.07960100545995163 | 0.179 |
| 0.3548330538249429 | 0.585 |
| 0.44598007365698644 | 0.652 |
| 0.5619707598838426 | 0.708 |
| 0.3589886940359206 | 0.676 |
| 0.3292795692567576 | 0.575 |
| 0.21096874990692616 | 0.558 |
| 0.17053561045033772 | 0.41 |
| 0.19012302871170428 | 0.607 |
| 0.1244404598583323 | 0.693 |
| 0.09450064372206302 | 0.442 |
| 0.31097175572308755 | 0.625 |
| 0.3526546998769686 | 0.515 |
| 0.3115282926403399 | 0.758 |
| 0.16639314867000532 | 0.737 |
| 0.15046189335747862 | 0.522 |
| 0.2550150775090466 | 0.545 |
| 0.46364683628798076 | 0.73 |
| 0.17412757924970146 | 0.319 |
| 0.5880411916882367 | 0.653 |
| 0.33879796416595964 | 0.699 |
| 0.307098797732241 | 0.423 |
| 0.37054835694606747 | 0.586 |
| 0.1526339563068726 | 0.606 |
| 0.15060669574451213 | 0.676 |
| 0.4375375956397435 | 0.658 |
| 0.27875409673427687 | 0.573 |
| 0.04773332947390374 | 0.632 |
| 0.1703982584536714 | 0.54 |
| 0.537262737174879 | 0.85 |
| 0.17327805345817604 | 0.472 |
| 0.3347922681635729 | 0.444 |
| 0.16699546983419 | 0.551 |
| 0.2491949431564644 | 0.658 |
| 0.3408463442916314 | 0.557 |
| 0.3018181736263986 | 0.544 |
| 0.2630286580046979 | 0.499 |
| 0.15208688011334304 | 0.373 |
| 0.2769633048374568 | 0.481 |
| 0.2555554071069631 | 0.664 |
| 0.4867842744057639 | 0.638 |
| 0.44233852450001376 | 0.579 |
| 0.3693201443969032 | 0.602 |
| 0.4494645416617409 | 0.773 |
| 0.3586725212109574 | 0.665 |
| 0.10119885550871366 | 0.5 |
| 0.46435854070713767 | 0.663 |
| 0.16992911906192343 | 0.275 |
| 0.3389529740056726 | 0.671 |
| 0.29251865023262724 | 0.471 |
| 0.03347709196434001 | 0.759 |
| 0.12613052939321068 | 0.554 |
| 0.16412171377033902 | 0.5 |
| 0.28415137925381495 | 0.359 |
| 0.24700895739633633 | 0.523 |
| 0.1486303265533242 | 0.403 |
| 0.22295135482638095 | 0.622 |
| 0.40436449821320597 | 0.762 |
| 0.16033485930652203 | 0.504 |
| 0.2473733793030487 | 0.47 |
| 0.32220353481964936 | 0.745 |
| 0.29977441032235197 | 0.558 |
| 0.1983676545755333 | 0.273 |
| 0.09151195048425687 | 0.261 |
| 0.1496808211085776 | 0.575 |
| 0.23442359257482726 | 0.443 |
| 0.31019590354363114 | 0.525 |
| 0.25910479116824026 | 0.711 |
| 0.23992623985024197 | 0.641 |
| 0.24392684706454693 | 0.696 |
| 0.16677827336764373 | 0.523 |
| 0.2679692190705132 | 0.486 |
| 0.6479480979386602 | 0.663 |
| 0.17405733185455396 | 0.261 |
| 0.32995653164650396 | 0.614 |
| 0.3539089902258217 | 0.498 |
| 0.07005208718208544 | 0.677 |
| 0.2429754947681544 | 0.552 |
| 0.07574109724506395 | 0.307 |
| 0.21634487266867986 | 0.49 |
| 0.16010085974990118 | 0.417 |
| 0.6611409372756615 | 0.702 |
| 0.2554730592037503 | 0.726 |
| 0.2126012511083767 | 0.31 |
| 0.13094081960708925 | 0.446 |
| 0.3590630103882104 | 0.478 |
| 0.25368137786999967 | 0.288 |
| 0.4411963173213864 | 0.791 |
| 0.2017332819549985 | 0.481 |
| 0.2549301807522302 | 0.357 |
| 0.3323813546878761 | 0.782 |
| 0.20301042931359703 | 0.716 |
| 0.09127762446575949 | 0.48 |
| 0.18732290550040254 | 0.382 |
| 0.08021767006110969 | 0.495 |
| 0.1805725571605431 | 0.282 |
| 0.2566501049186404 | 0.443 |
| 0.2307906047939522 | 0.489 |
| 0.1853474545566528 | 0.547 |
| 0.4051802588377733 | 0.626 |
| 0.40505899164643255 | 0.694 |
| 0.45971749581573296 | 0.738 |
| 0.34953410510427896 | 0.636 |
| 0.20293233651296128 | 0.425 |
| 0.19670512418721386 | 0.529 |
| 0.568572435401568 | 0.741 |
| 0.1160360218340416 | 0.393 |
| 0.20236390576673968 | 0.443 |
| 0.30897059193244236 | 0.681 |
| 0.1349845245582999 | 0.277 |
| 0.27685431948740435 | 0.633 |
| 0.5126120046229747 | 0.769 |
| 0.2436035758131243 | 0.869 |
| 0.0995913109259643 | 0.502 |
| 0.3841598963772601 | 0.63 |
| 0.24670765885257406 | 0.35 |
| 0.2076774290507708 | 0.545 |
| 0.23406634211055577 | 0.484 |
| 0.1426784926811281 | 0.301 |
| 0.23396546033344423 | 0.544 |
| 0.35563192292058177 | 0.667 |
| 0.1481939978814154 | 0.251 |
| 0.4778115762841846 | 0.686 |
| 0.33674028190100813 | 0.586 |
| 0.301922794967903 | 0.609 |
| 0.49350998208844965 | 0.763 |
| 0.525495724102478 | 0.662 |
| 0.43601897341860385 | 0.815 |
| 0.17300408937429268 | 0.536 |
| 0.3213756920297066 | 0.742 |
| 0.3138647894505575 | 0.638 |
| 0.23140024072691656 | 0.337 |
| 0.28460164674209354 | 0.532 |
| 0.16171690495458302 | 0.411 |
| 0.4021616223154709 | 0.592 |
| 0.40254137309926163 | 0.645 |
| 0.23518708572970037 | 0.386 |
| 0.16017856301419187 | 0.275 |
| 0.37489394925245056 | 0.587 |
| 0.2084740795422665 | 0.321 |
| 0.1420380503462202 | 0.344 |
| 0.5547615004811348 | 0.689 |
| 0.03869710083795974 | 0.43 |
| 0.42301905767711334 | 0.553 |
| 0.12172883742434804 | 0.357 |
| 0.5598502144809653 | 0.746 |
| 0.32932017290175886 | 0.435 |
| 0.5617596022076511 | 0.81 |
| 0.21831499358191397 | 0.494 |
| 0.2915228857916806 | 0.599 |
| 0.09419509072471155 | 0.468 |
| 0.2476128449182985 | 0.531 |
| 0.22553128211510853 | 0.464 |
| 0.14717363531990624 | 0.395 |
| 0.30822501043038375 | 0.623 |
| 0.2373639577764165 | 0.448 |
| 0.2244955747104841 | 0.534 |
| 0.14229902341991663 | 0.795 |
| 0.4201631647989348 | 0.533 |
| 0.6120908365493279 | 0.692 |
| 0.2791610159181842 | 0.627 |
| 0.3898694547106317 | 0.744 |
| 0.1537208820629007 | 0.611 |
| 0.15677545084698308 | 0.471 |
| 0.2669841850983601 | 0.329 |
| 0.13050491033866374 | 0.411 |
| 0.09966529822439285 | 0.35 |
| 0.4539248223569372 | 0.566 |
| 0.18770789301977153 | 0.321 |
| 0.0886517519894624 | 0.304 |
| 0.04795707154857776 | 0.445 |
| 0.35951044764995577 | 0.658 |
| 0.20371283583427902 | 0.516 |
| 0.3571396065869815 | 0.637 |
| 0.375190128783613 | 0.589 |
| 0.45519949633038737 | 0.683 |
| 0.1409938713534189 | 0.466 |
| 0.16451747460054356 | 0.525 |
| 0.3765897923608036 | 0.626 |
| 0.23108865691170233 | 0.338 |
| 0.3359157424871698 | 0.535 |
| 0.09851184103721833 | 0.4 |
| 0.2625162566540905 | 0.488 |
| 0.29948741159046877 | 0.672 |
| 0.3761690510887119 | 0.564 |
| 0.4076922673741087 | 0.691 |
| 0.4140165565694911 | 0.756 |
| 0.44085568969553124 | 0.553 |
| 0.15242240345470603 | 0.514 |
| 0.21362087518964856 | 0.387 |
| 0.1390493195768342 | 0.355 |
| 0.5557372869363414 | 0.618 |
| 0.25177360688674266 | 0.556 |
| 0.22227956568403562 | 0.354 |
| 0.18678352846920143 | 0.448 |
| 0.3378710657114782 | 0.46 |
| 0.19037209278636646 | 0.463 |
| 0.3444140373537663 | 0.525 |
| 0.2343378874811164 | 0.582 |
| 0.27965071498744587 | 0.561 |
| 0.33454659444067225 | 0.59 |
| 0.24472662031199344 | 0.468 |
| 0.2879379813702776 | 0.535 |
| 0.10685631841377607 | 0.236 |
| 0.2611985070870205 | 0.541 |
| 0.19938446003609 | 0.324 |